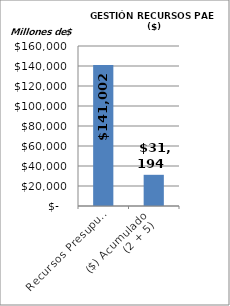
| Category | RECURSOS PAE ($) |
|---|---|
| Recursos Presupuestados | 141002.321 |
| ($) Acumulado
(2 + 5) | 31194 |